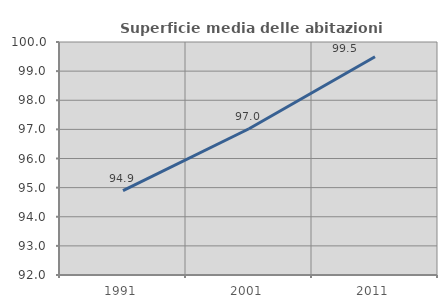
| Category | Superficie media delle abitazioni occupate |
|---|---|
| 1991.0 | 94.899 |
| 2001.0 | 97.022 |
| 2011.0 | 99.491 |